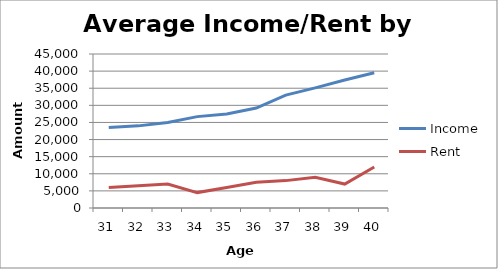
| Category | Income | Rent |
|---|---|---|
| 31.0 | 23500 | 6000 |
| 32.0 | 24000 | 6500 |
| 33.0 | 25000 | 7000 |
| 34.0 | 26700 | 4500 |
| 35.0 | 27500 | 6000 |
| 36.0 | 29200 | 7500 |
| 37.0 | 33000 | 8000 |
| 38.0 | 35100 | 9000 |
| 39.0 | 37400 | 7000 |
| 40.0 | 39500 | 12000 |